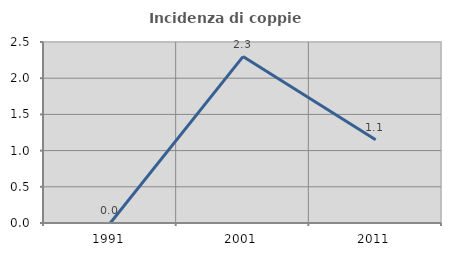
| Category | Incidenza di coppie miste |
|---|---|
| 1991.0 | 0 |
| 2001.0 | 2.299 |
| 2011.0 | 1.149 |